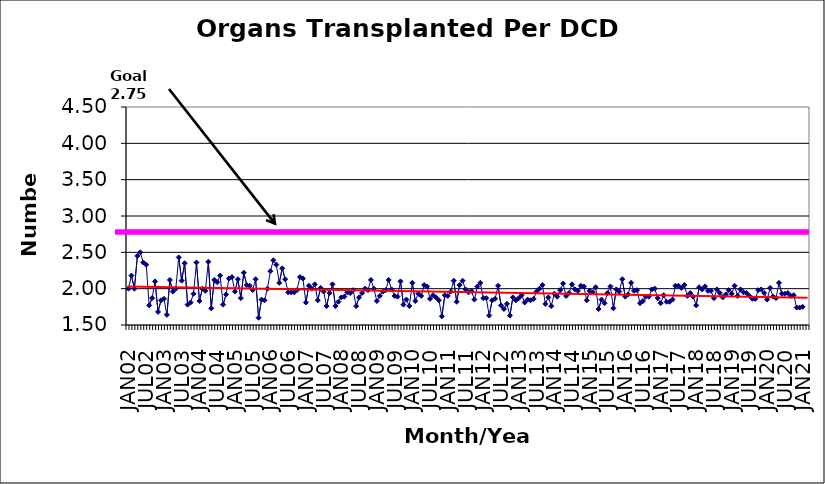
| Category | Series 0 |
|---|---|
| JAN02 | 2 |
| FEB02 | 2.18 |
| MAR02 | 2 |
| APR02 | 2.45 |
| MAY02 | 2.5 |
| JUN02 | 2.36 |
| JUL02 | 2.33 |
| AUG02 | 1.77 |
| SEP02 | 1.87 |
| OCT02 | 2.1 |
| NOV02 | 1.68 |
| DEC02 | 1.84 |
| JAN03 | 1.86 |
| FEB03 | 1.64 |
| MAR03 | 2.12 |
| APR03 | 1.96 |
| MAY03 | 2 |
| JUN03 | 2.43 |
| JUL03 | 2.11 |
| AUG03 | 2.35 |
| SEP03 | 1.78 |
| OCT03 | 1.81 |
| NOV03 | 1.93 |
| DEC03 | 2.36 |
| JAN04 | 1.83 |
| FEB04 | 2 |
| MAR04 | 1.97 |
| APR04 | 2.37 |
| MAY04 | 1.73 |
| JUN04 | 2.12 |
| JUL04 | 2.09 |
| AUG04 | 2.18 |
| SEP04 | 1.78 |
| OCT04 | 1.92 |
| NOV04 | 2.14 |
| DEC04 | 2.16 |
| JAN05 | 1.96 |
| FEB05 | 2.13 |
| MAR05 | 1.87 |
| APR05 | 2.22 |
| MAY05 | 2.05 |
| JUN05 | 2.04 |
| JUL05 | 1.98 |
| AUG05 | 2.13 |
| SEP05 | 1.6 |
| OCT05 | 1.85 |
| NOV05 | 1.84 |
| DEC05 | 2 |
| JAN06 | 2.24 |
| FEB06 | 2.39 |
| MAR06 | 2.33 |
| APR06 | 2.08 |
| MAY06 | 2.28 |
| JUN06 | 2.13 |
| JUL06 | 1.95 |
| AUG06 | 1.95 |
| SEP06 | 1.95 |
| OCT06 | 1.98 |
| NOV06 | 2.16 |
| DEC06 | 2.14 |
| JAN07 | 1.81 |
| FEB07 | 2.04 |
| MAR07 | 2 |
| APR07 | 2.06 |
| MAY07 | 1.84 |
| JUN07 | 2.01 |
| JUL07 | 1.96 |
| AUG07 | 1.76 |
| SEP07 | 1.94 |
| OCT07 | 2.06 |
| NOV07 | 1.76 |
| DEC07 | 1.82 |
| JAN08 | 1.88 |
| FEB08 | 1.89 |
| MAR08 | 1.95 |
| APR08 | 1.94 |
| MAY08 | 1.98 |
| JUN08 | 1.76 |
| JUL08 | 1.88 |
| AUG08 | 1.94 |
| SEP08 | 2 |
| OCT08 | 1.98 |
| NOV08 | 2.12 |
| DEC08 | 2 |
| JAN09 | 1.83 |
| FEB09 | 1.9 |
| MAR09 | 1.96 |
| APR09 | 1.98 |
| MAY09 | 2.12 |
| JUN09 | 1.99 |
| JUL09 | 1.9 |
| AUG09 | 1.89 |
| SEP09 | 2.1 |
| OCT09 | 1.78 |
| NOV09 | 1.85 |
| DEC09 | 1.76 |
| JAN10 | 2.08 |
| FEB10 | 1.83 |
| MAR10 | 1.93 |
| APR10 | 1.9 |
| MAY10 | 2.05 |
| JUN10 | 2.03 |
| JUL10 | 1.86 |
| AUG10 | 1.91 |
| SEP10 | 1.88 |
| OCT10 | 1.84 |
| NOV10 | 1.62 |
| DEC10 | 1.91 |
| JAN11 | 1.9 |
| FEB11 | 1.96 |
| MAR11 | 2.11 |
| APR11 | 1.82 |
| MAY11 | 2.05 |
| JUN11 | 2.11 |
| JUL11 | 1.99 |
| AUG11 | 1.95 |
| SEP11 | 1.97 |
| OCT11 | 1.85 |
| NOV11 | 2.03 |
| DEC11 | 2.08 |
| JAN12 | 1.87 |
| FEB12 | 1.87 |
| MAR12 | 1.63 |
| APR12 | 1.84 |
| MAY12 | 1.86 |
| JUN12 | 2.04 |
| JUL12 | 1.77 |
| AUG12 | 1.72 |
| SEP12 | 1.79 |
| OCT12 | 1.63 |
| NOV12 | 1.88 |
| DEC12 | 1.84 |
| JAN13 | 1.87 |
| FEB13 | 1.91 |
| MAR13 | 1.81 |
| APR13 | 1.85 |
| MAY13 | 1.84 |
| JUN13 | 1.86 |
| JUL13 | 1.96 |
| AUG13 | 2 |
| SEP13 | 2.05 |
| OCT13 | 1.79 |
| NOV13 | 1.88 |
| DEC13 | 1.76 |
| JAN14 | 1.93 |
| FEB14 | 1.89 |
| MAR14 | 1.98 |
| APR14 | 2.07 |
| MAY14 | 1.9 |
| JUN14 | 1.94 |
| JUL14 | 2.06 |
| AUG14 | 1.99 |
| SEP14 | 1.97 |
| OCT14 | 2.04 |
| NOV14 | 2.03 |
| DEC14 | 1.84 |
| JAN15 | 1.97 |
| FEB15 | 1.95 |
| MAR15 | 2.02 |
| APR15 | 1.72 |
| MAY15 | 1.85 |
| JUN15 | 1.8 |
| JUL15 | 1.94 |
| AUG15 | 2.03 |
| SEP15 | 1.73 |
| OCT15 | 1.99 |
| NOV15 | 1.96 |
| DEC15 | 2.13 |
| JAN16 | 1.89 |
| FEB16 | 1.92 |
| MAR16 | 2.08 |
| APR16 | 1.97 |
| MAY16 | 1.98 |
| JUN16 | 1.8 |
| JUL16 | 1.83 |
| AUG16 | 1.89 |
| SEP16 | 1.89 |
| OCT16 | 1.99 |
| NOV16 | 2 |
| DEC16 | 1.87 |
| JAN17 | 1.8 |
| FEB17 | 1.91 |
| MAR17 | 1.82 |
| APR17 | 1.82 |
| MAY17 | 1.85 |
| JUN17 | 2.04 |
| JUL17 | 2.04 |
| AUG17 | 2.01 |
| SEP17 | 2.05 |
| OCT17 | 1.9 |
| NOV17 | 1.94 |
| DEC17 | 1.89 |
| JAN18 | 1.77 |
| FEB18 | 2.02 |
| MAR18 | 1.99 |
| APR18 | 2.03 |
| MAY18 | 1.97 |
| JUN18 | 1.97 |
| JUL18 | 1.87 |
| AUG18 | 1.99 |
| SEP18 | 1.94 |
| OCT18 | 1.88 |
| NOV18 | 1.92 |
| DEC18 | 1.98 |
| JAN19 | 1.93 |
| FEB19 | 2.04 |
| MAR19 | 1.9 |
| APR19 | 1.99 |
| MAY19 | 1.95 |
| JUN19 | 1.94 |
| JUL19 | 1.9 |
| AUG19 | 1.86 |
| SEP19 | 1.86 |
| OCT19 | 1.98 |
| NOV19 | 1.99 |
| DEC19 | 1.94 |
| JAN20 | 1.85 |
| FEB20 | 2.01 |
| MAR20 | 1.89 |
| APR20 | 1.87 |
| MAY20 | 2.08 |
| JUN20 | 1.93 |
| JUL20 | 1.93 |
| AUG20 | 1.94 |
| SEP20 | 1.9 |
| OCT20 | 1.91 |
| NOV20 | 1.74 |
| DEC20 | 1.74 |
| JAN21 | 1.75 |